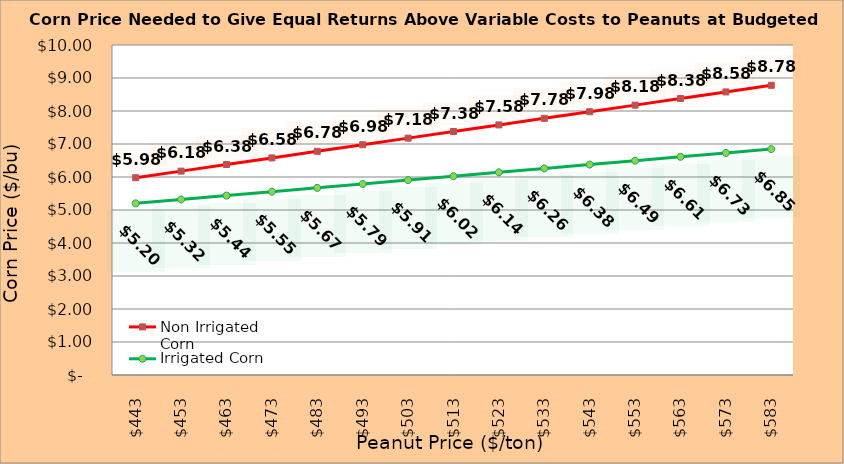
| Category | Non Irrigated Corn | Irrigated Corn |
|---|---|---|
| 442.5 | 5.978 | 5.202 |
| 452.5 | 6.178 | 5.319 |
| 462.5 | 6.378 | 5.437 |
| 472.5 | 6.578 | 5.554 |
| 482.5 | 6.778 | 5.672 |
| 492.5 | 6.978 | 5.789 |
| 502.5 | 7.178 | 5.907 |
| 512.5 | 7.378 | 6.024 |
| 522.5 | 7.578 | 6.142 |
| 532.5 | 7.778 | 6.259 |
| 542.5 | 7.978 | 6.377 |
| 552.5 | 8.178 | 6.494 |
| 562.5 | 8.378 | 6.612 |
| 572.5 | 8.578 | 6.729 |
| 582.5 | 8.778 | 6.847 |